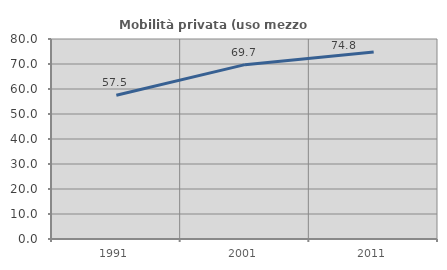
| Category | Mobilità privata (uso mezzo privato) |
|---|---|
| 1991.0 | 57.529 |
| 2001.0 | 69.737 |
| 2011.0 | 74.775 |